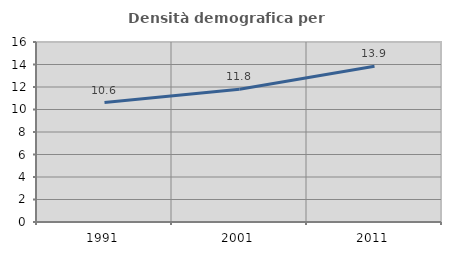
| Category | Densità demografica |
|---|---|
| 1991.0 | 10.618 |
| 2001.0 | 11.792 |
| 2011.0 | 13.853 |